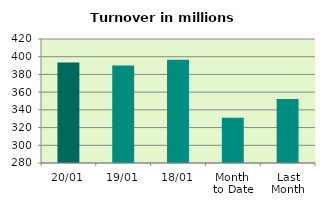
| Category | Series 0 |
|---|---|
| 20/01 | 393.602 |
| 19/01 | 390.217 |
| 18/01 | 396.561 |
| Month 
to Date | 331.074 |
| Last
Month | 352.227 |